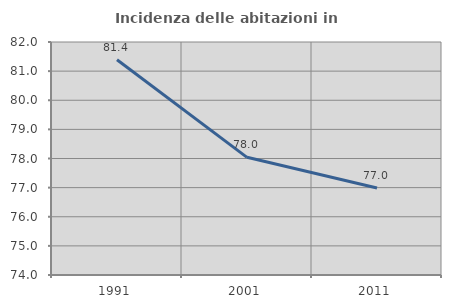
| Category | Incidenza delle abitazioni in proprietà  |
|---|---|
| 1991.0 | 81.392 |
| 2001.0 | 78.04 |
| 2011.0 | 76.986 |